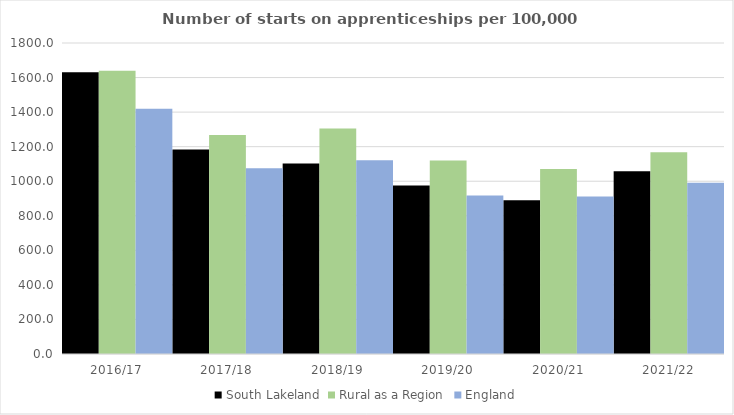
| Category | South Lakeland | Rural as a Region | England |
|---|---|---|---|
| 2016/17 | 1630 | 1638.789 | 1420 |
| 2017/18 | 1183 | 1267.474 | 1075 |
| 2018/19 | 1103 | 1304.57 | 1122 |
| 2019/20 | 975 | 1119.662 | 918 |
| 2020/21 | 890 | 1070.748 | 912 |
| 2021/22 | 1057 | 1167.68 | 991 |